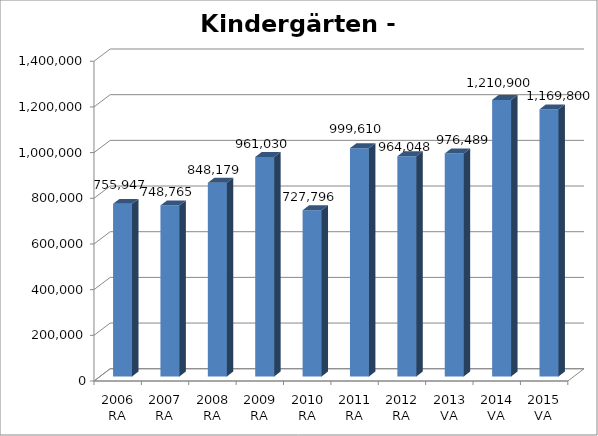
| Category | Kindergärten - Nettoaufwand |
|---|---|
| 2006 RA | 755947.37 |
| 2007 RA | 748764.57 |
| 2008 RA | 848178.67 |
| 2009 RA | 961030.14 |
| 2010 RA | 727795.87 |
| 2011 RA | 999609.96 |
| 2012 RA | 964048.48 |
| 2013 VA | 976489.28 |
| 2014 VA | 1210900 |
| 2015 VA | 1169800 |